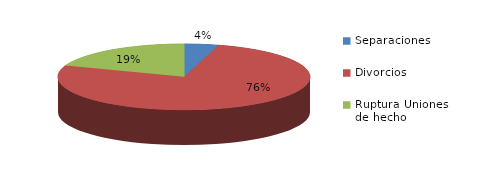
| Category | Series 0 |
|---|---|
| Separaciones | 15 |
| Divorcios | 259 |
| Ruptura Uniones de hecho | 66 |